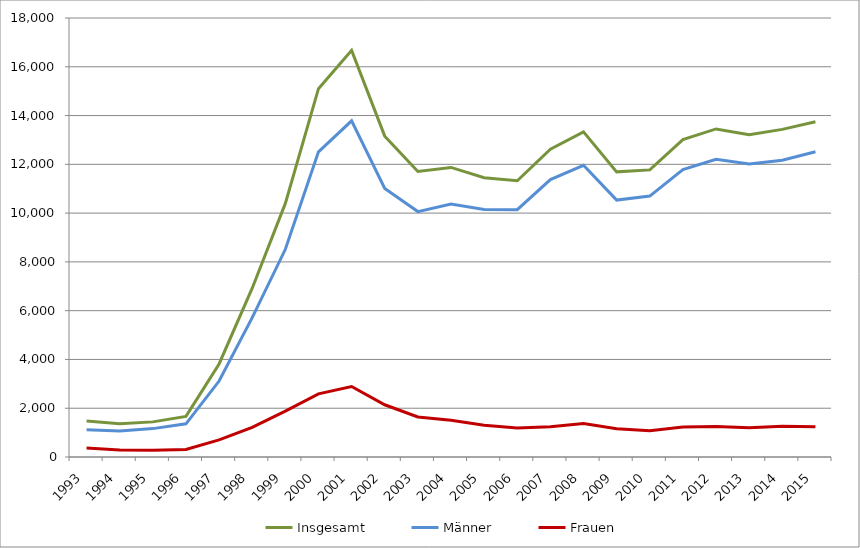
| Category | Insgesamt  | Männer | Frauen |
|---|---|---|---|
| 1993.0 | 1479 | 1113 | 366 |
| 1994.0 | 1359 | 1071 | 288 |
| 1995.0 | 1440 | 1164 | 276 |
| 1996.0 | 1665 | 1359 | 306 |
| 1997.0 | 3816 | 3114 | 702 |
| 1998.0 | 6921 | 5712 | 1212 |
| 1999.0 | 10398 | 8517 | 1881 |
| 2000.0 | 15102 | 12513 | 2589 |
| 2001.0 | 16674 | 13785 | 2889 |
| 2002.0 | 13155 | 11010 | 2142 |
| 2003.0 | 11706 | 10062 | 1644 |
| 2004.0 | 11874 | 10371 | 1503 |
| 2005.0 | 11451 | 10149 | 1302 |
| 2006.0 | 11328 | 10140 | 1188 |
| 2007.0 | 12621 | 11376 | 1245 |
| 2008.0 | 13332 | 11961 | 1371 |
| 2009.0 | 11691 | 10533 | 1158 |
| 2010.0 | 11772 | 10698 | 1074 |
| 2011.0 | 13014 | 11784 | 1230 |
| 2012.0 | 13452 | 12204 | 1248 |
| 2013.0 | 13209 | 12012 | 1197 |
| 2014.0 | 13434 | 12171 | 1263 |
| 2015.0 | 13749 | 12513 | 1236 |